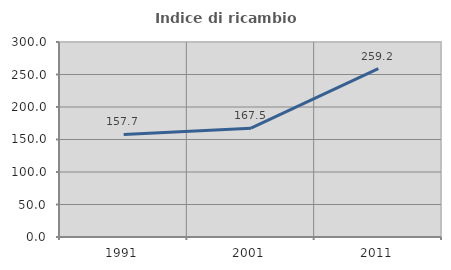
| Category | Indice di ricambio occupazionale  |
|---|---|
| 1991.0 | 157.749 |
| 2001.0 | 167.483 |
| 2011.0 | 259.161 |